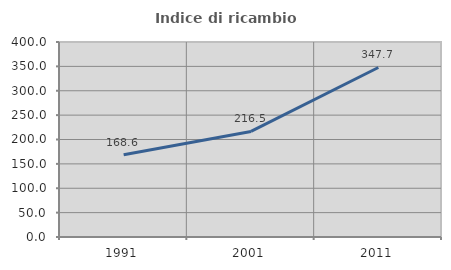
| Category | Indice di ricambio occupazionale  |
|---|---|
| 1991.0 | 168.644 |
| 2001.0 | 216.522 |
| 2011.0 | 347.727 |